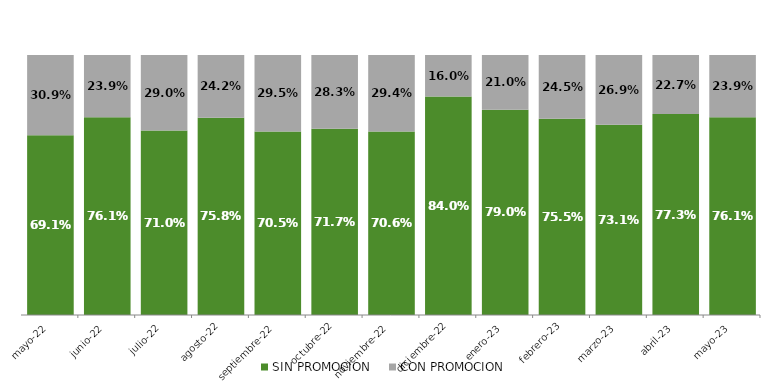
| Category | SIN PROMOCION   | CON PROMOCION   |
|---|---|---|
| 2022-05-01 | 0.691 | 0.309 |
| 2022-06-01 | 0.761 | 0.239 |
| 2022-07-01 | 0.71 | 0.29 |
| 2022-08-01 | 0.758 | 0.242 |
| 2022-09-01 | 0.705 | 0.295 |
| 2022-10-01 | 0.717 | 0.283 |
| 2022-11-01 | 0.706 | 0.294 |
| 2022-12-01 | 0.84 | 0.16 |
| 2023-01-01 | 0.79 | 0.21 |
| 2023-02-01 | 0.755 | 0.245 |
| 2023-03-01 | 0.731 | 0.269 |
| 2023-04-01 | 0.773 | 0.227 |
| 2023-05-01 | 0.761 | 0.239 |